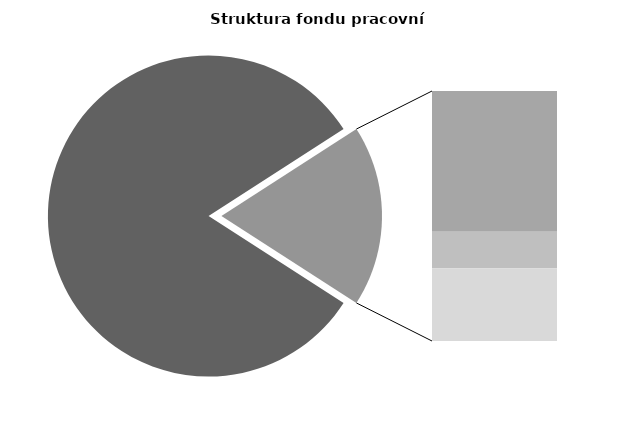
| Category | Series 0 |
|---|---|
| Průměrná měsíční odpracovaná doba bez přesčasu | 140.379 |
| Dovolená | 17.592 |
| Nemoc | 4.595 |
| Jiné | 9.084 |